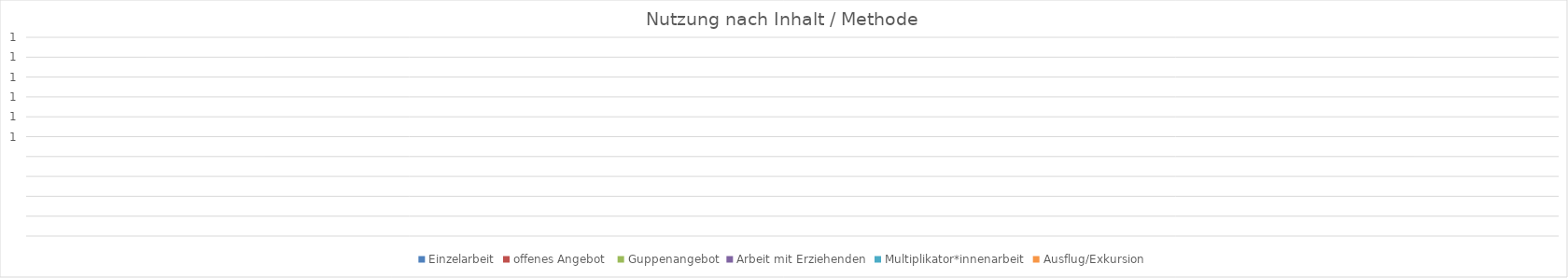
| Category | Einzelarbeit | offenes Angebot  | Guppenangebot | Arbeit mit Erziehenden | Multiplikator*innenarbeit | Ausflug/Exkursion |
|---|---|---|---|---|---|---|
| 0 | 0 | 0 | 0 | 0 | 0 | 0 |